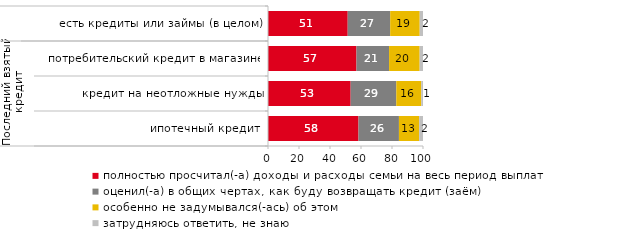
| Category | полностью просчитал(-а) доходы и расходы семьи на весь период выплат | оценил(-а) в общих чертах, как буду возвращать кредит (заём) | особенно не задумывался(-ась) об этом | затрудняюсь ответить, не знаю |
|---|---|---|---|---|
| 0 | 51.432 | 27.397 | 19.054 | 2.117 |
| 1 | 57.082 | 21.03 | 19.742 | 2.146 |
| 2 | 53.333 | 29.444 | 16.111 | 1.111 |
| 3 | 58.385 | 26.087 | 13.043 | 2.484 |